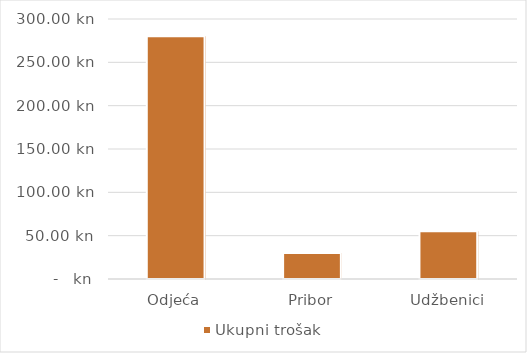
| Category | Ukupni trošak |
|---|---|
| Odjeća | 280 |
| Pribor | 30 |
| Udžbenici | 55 |